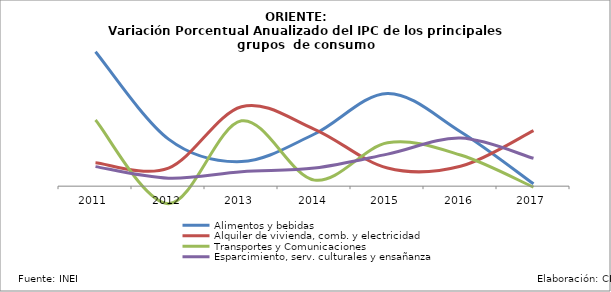
| Category | Alimentos y bebidas | Alquiler de vivienda, comb. y electricidad | Transportes y Comunicaciones | Esparcimiento, serv. culturales y ensañanza |
|---|---|---|---|---|
| 2011.0 | 0.087 | 0.015 | 0.043 | 0.013 |
| 2012.0 | 0.031 | 0.012 | -0.011 | 0.005 |
| 2013.0 | 0.016 | 0.052 | 0.042 | 0.009 |
| 2014.0 | 0.034 | 0.037 | 0.004 | 0.012 |
| 2015.0 | 0.06 | 0.012 | 0.028 | 0.021 |
| 2016.0 | 0.035 | 0.013 | 0.02 | 0.031 |
| 2017.0 | 0.002 | 0.036 | -0.001 | 0.018 |